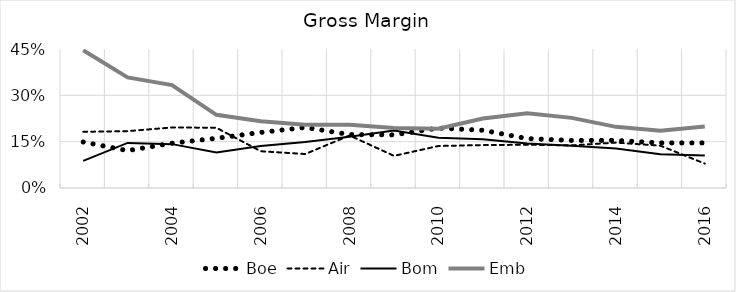
| Category | Boe | Air | Bom | Emb |
|---|---|---|---|---|
| 2002.0 | 0.149 | 0.182 | 0.088 | 0.446 |
| 2003.0 | 0.121 | 0.184 | 0.146 | 0.358 |
| 2004.0 | 0.145 | 0.196 | 0.142 | 0.333 |
| 2005.0 | 0.161 | 0.195 | 0.115 | 0.237 |
| 2006.0 | 0.18 | 0.119 | 0.136 | 0.216 |
| 2007.0 | 0.196 | 0.11 | 0.149 | 0.205 |
| 2008.0 | 0.173 | 0.17 | 0.166 | 0.205 |
| 2009.0 | 0.172 | 0.104 | 0.186 | 0.194 |
| 2010.0 | 0.194 | 0.136 | 0.163 | 0.192 |
| 2011.0 | 0.187 | 0.139 | 0.158 | 0.225 |
| 2012.0 | 0.16 | 0.14 | 0.144 | 0.242 |
| 2013.0 | 0.154 | 0.138 | 0.137 | 0.227 |
| 2014.0 | 0.154 | 0.147 | 0.128 | 0.198 |
| 2015.0 | 0.146 | 0.137 | 0.109 | 0.185 |
| 2016.0 | 0.146 | 0.079 | 0.105 | 0.199 |